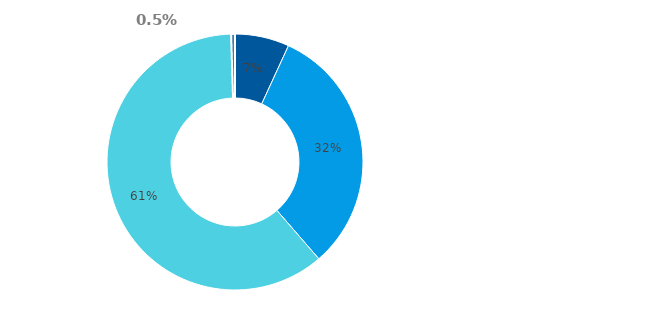
| Category | Series 3 |
|---|---|
| Hotovost | 0.069 |
| Půjčky poskytnuté nemovitostní společnosti | 0.318 |
| Majetkové účasti v nemovitostní společnosti | 0.609 |
| Ostatní finanční aktiva | 0.005 |